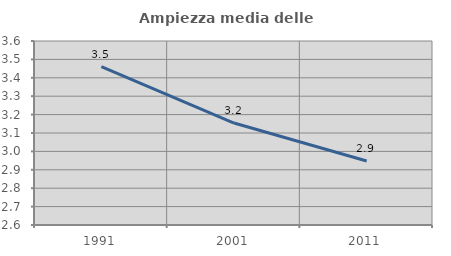
| Category | Ampiezza media delle famiglie |
|---|---|
| 1991.0 | 3.461 |
| 2001.0 | 3.154 |
| 2011.0 | 2.948 |